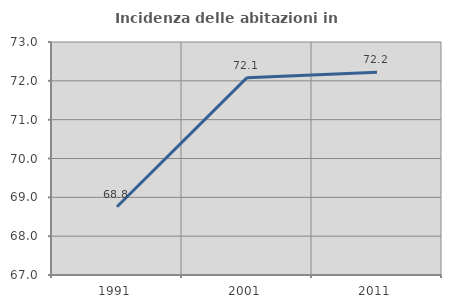
| Category | Incidenza delle abitazioni in proprietà  |
|---|---|
| 1991.0 | 68.757 |
| 2001.0 | 72.082 |
| 2011.0 | 72.22 |